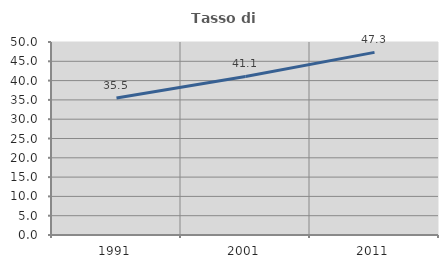
| Category | Tasso di occupazione   |
|---|---|
| 1991.0 | 35.507 |
| 2001.0 | 41.071 |
| 2011.0 | 47.312 |